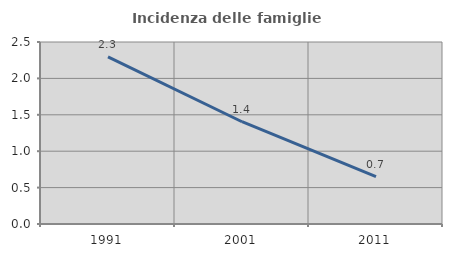
| Category | Incidenza delle famiglie numerose |
|---|---|
| 1991.0 | 2.297 |
| 2001.0 | 1.405 |
| 2011.0 | 0.651 |